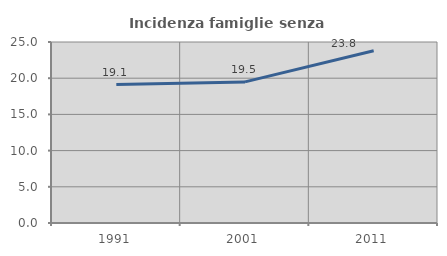
| Category | Incidenza famiglie senza nuclei |
|---|---|
| 1991.0 | 19.118 |
| 2001.0 | 19.491 |
| 2011.0 | 23.795 |